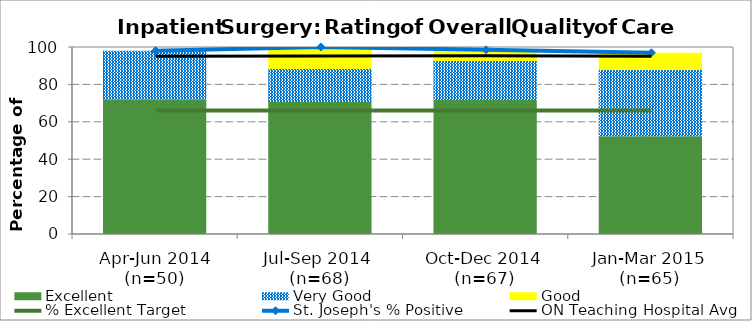
| Category | Excellent | Very Good | Good |
|---|---|---|---|
| Apr-Jun 2014 (n=50) | 72 | 26 | 0 |
| Jul-Sep 2014 
(n=68) | 70.59 | 17.65 | 11.76 |
| Oct-Dec 2014 (n=67) | 71.64 | 20.9 | 5.97 |
| Jan-Mar 2015 (n=65) | 52.3 | 35.4 | 9.2 |